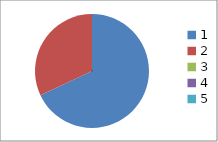
| Category | Series 0 |
|---|---|
| 0 | 0.68 |
| 1 | 0.32 |
| 2 | 0 |
| 3 | 0 |
| 4 | 0 |